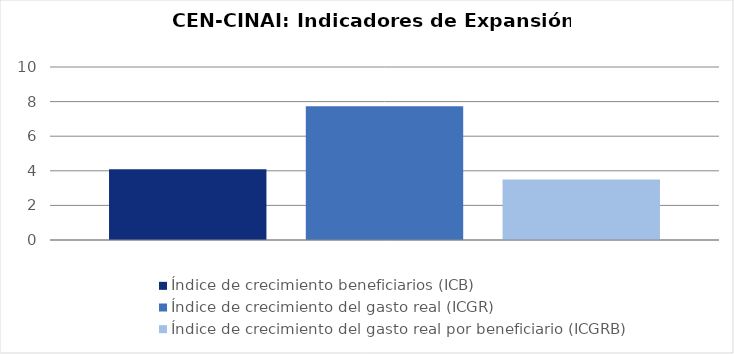
| Category | Índice de crecimiento beneficiarios (ICB)  | Índice de crecimiento del gasto real (ICGR)  | Índice de crecimiento del gasto real por beneficiario (ICGRB)  |
|---|---|---|---|
| Total programa | 4.083 | 7.725 | 3.5 |